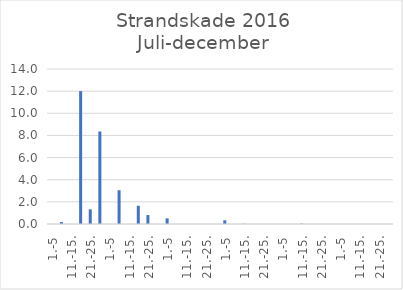
| Category | Series 0 |
|---|---|
| 1.-5 | 0 |
| 6.-10. | 0.173 |
| 11.-15. | 0 |
| 16.-20. | 12 |
| 21.-25. | 1.326 |
| 26.-31. | 8.356 |
| 1.-5 | 0 |
| 6.-10. | 3.052 |
| 11.-15. | 0 |
| 16.-20. | 1.65 |
| 21.-25. | 0.809 |
| 26.-31. | 0 |
| 1.-5 | 0.51 |
| 6.-10. | 0 |
| 11.-15. | 0 |
| 16.-20. | 0 |
| 21.-25. | 0 |
| 26.-30. | 0 |
| 1.-5 | 0.337 |
| 6.-10. | 0 |
| 11.-15. | 0.024 |
| 16.-20. | 0 |
| 21.-25. | 0 |
| 26.-31. | 0 |
| 1.-5 | 0 |
| 6.-10. | 0 |
| 11.-15. | 0.032 |
| 16.-20. | 0 |
| 21.-25. | 0 |
| 26.-30. | 0 |
| 1.-5 | 0 |
| 6.-10. | 0 |
| 11.-15. | 0 |
| 16.-20. | 0 |
| 21.-25. | 0 |
| 26.-31. | 0 |